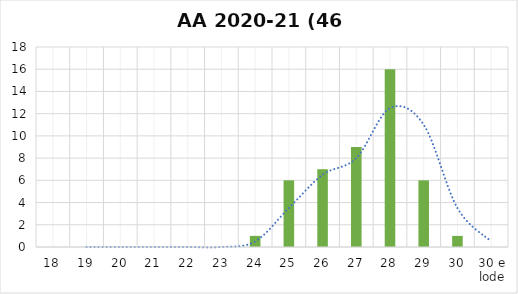
| Category | Series 0 |
|---|---|
| 18 | 0 |
| 19 | 0 |
| 20 | 0 |
| 21 | 0 |
| 22 | 0 |
| 23 | 0 |
| 24 | 1 |
| 25 | 6 |
| 26 | 7 |
| 27 | 9 |
| 28 | 16 |
| 29 | 6 |
| 30 | 1 |
| 30 e lode | 0 |